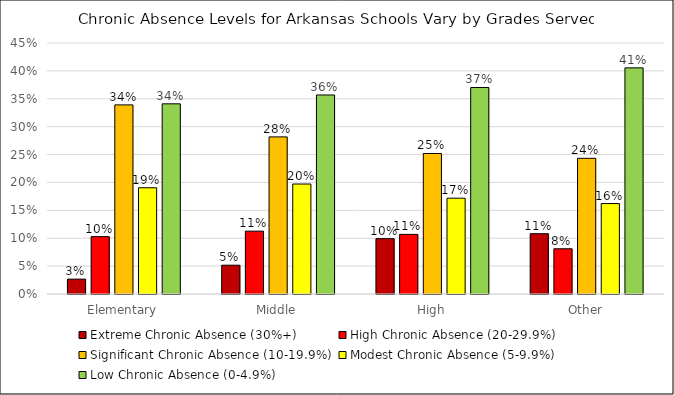
| Category | Extreme Chronic Absence (30%+) | High Chronic Absence (20-29.9%) | Significant Chronic Absence (10-19.9%) | Modest Chronic Absence (5-9.9%) | Low Chronic Absence (0-4.9%) |
|---|---|---|---|---|---|
| Elementary | 0.027 | 0.103 | 0.339 | 0.19 | 0.341 |
| Middle | 0.052 | 0.113 | 0.282 | 0.197 | 0.357 |
| High | 0.099 | 0.107 | 0.252 | 0.172 | 0.37 |
| Other | 0.108 | 0.081 | 0.243 | 0.162 | 0.405 |